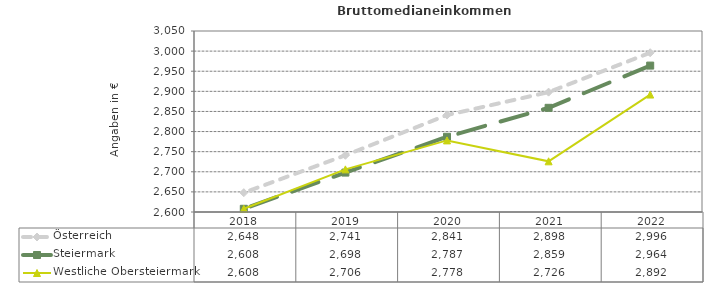
| Category | Österreich | Steiermark | Westliche Obersteiermark |
|---|---|---|---|
| 2022.0 | 2996 | 2964 | 2892 |
| 2021.0 | 2898 | 2859 | 2726 |
| 2020.0 | 2841 | 2787 | 2778 |
| 2019.0 | 2741 | 2698 | 2706 |
| 2018.0 | 2648 | 2608 | 2608 |